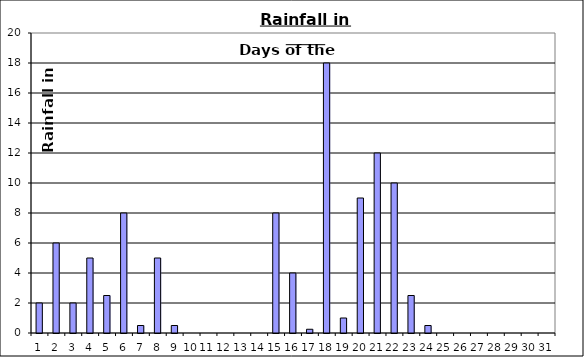
| Category | Series 0 |
|---|---|
| 0 | 2 |
| 1 | 6 |
| 2 | 2 |
| 3 | 5 |
| 4 | 2.5 |
| 5 | 8 |
| 6 | 0.5 |
| 7 | 5 |
| 8 | 0.5 |
| 9 | 0 |
| 10 | 0 |
| 11 | 0 |
| 12 | 0 |
| 13 | 0 |
| 14 | 8 |
| 15 | 4 |
| 16 | 0.25 |
| 17 | 18 |
| 18 | 1 |
| 19 | 9 |
| 20 | 12 |
| 21 | 10 |
| 22 | 2.5 |
| 23 | 0.5 |
| 24 | 0 |
| 25 | 0 |
| 26 | 0 |
| 27 | 0 |
| 28 | 0 |
| 29 | 0 |
| 30 | 0 |